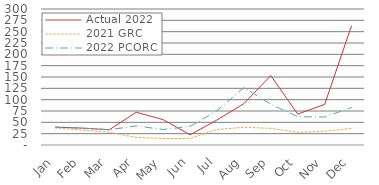
| Category | Actual 2022 | 2021 GRC | 2022 PCORC |
|---|---|---|---|
| Jan | 39.36 | 37.653 | 39.36 |
| Feb | 37.252 | 32.945 | 37.252 |
| Mar | 33.663 | 28.09 | 33.663 |
| Apr | 72.205 | 16.712 | 42.093 |
| May | 56.039 | 14.422 | 34.196 |
| Jun | 22.353 | 14.339 | 40.816 |
| Jul | 55.219 | 34.105 | 75.566 |
| Aug | 91.247 | 39.192 | 126.873 |
| Sep | 153.161 | 36.683 | 89.939 |
| Oct | 68.179 | 27.918 | 62.341 |
| Nov | 89.507 | 30.123 | 61.799 |
| Dec | 263.059 | 36.461 | 82.644 |